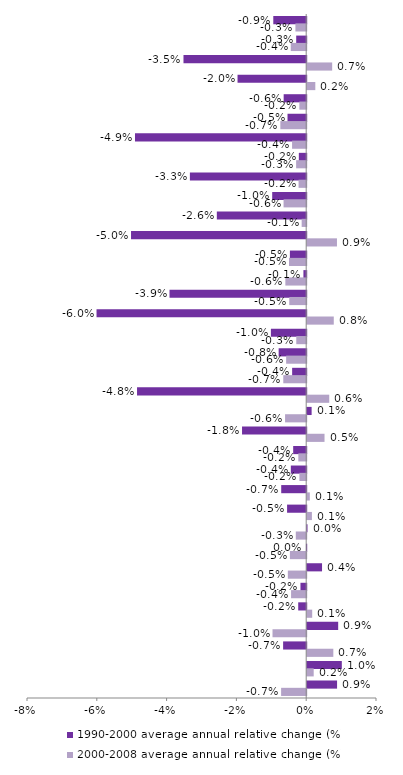
| Category | 1990-2000 average annual relative change (%) | 2000-2008 average annual relative change (%) |
|---|---|---|
| EU-27 | -0.009 | -0.003 |
| EU-15 | -0.003 | -0.004 |
| Romania | -0.035 | 0.007 |
| Poland | -0.02 | 0.002 |
| Germany | -0.006 | -0.002 |
| United Kingdom | -0.005 | -0.007 |
| Bulgaria | -0.049 | -0.004 |
| France | -0.002 | -0.003 |
| Czech Republic | -0.033 | -0.002 |
| Netherlands | -0.01 | -0.006 |
| Hungary | -0.026 | -0.001 |
| Lithuania | -0.05 | 0.009 |
| Turkey | -0.005 | -0.005 |
| Italy | -0.001 | -0.006 |
| Slovakia | -0.039 | -0.005 |
| Latvia | -0.06 | 0.008 |
| Denmark | -0.01 | -0.003 |
| Greece | -0.008 | -0.006 |
| Belgium | -0.004 | -0.007 |
| Estonia | -0.048 | 0.006 |
| Ireland | 0.001 | -0.006 |
| Croatia | -0.018 | 0.005 |
| Sweden | -0.004 | -0.002 |
| Austria | -0.004 | -0.002 |
| Finland | -0.007 | 0.001 |
| Switzerland | -0.005 | 0.001 |
| Norway | 0 | -0.003 |
| Slovenia | 0 | -0.005 |
| Portugal | 0.004 | -0.005 |
| Luxembourg | -0.002 | -0.004 |
| Iceland | -0.002 | 0.001 |
| Malta | 0.009 | -0.01 |
| Liechtenstein | -0.007 | 0.007 |
| Cyprus | 0.01 | 0.002 |
| Spain | 0.009 | -0.007 |